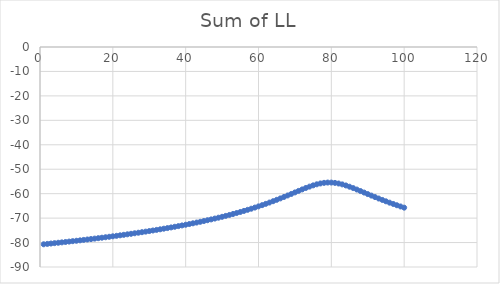
| Category | Sum of LL |
|---|---|
| 1.0 | -80.704 |
| 2.0 | -80.552 |
| 3.0 | -80.398 |
| 4.0 | -80.243 |
| 5.0 | -80.085 |
| 6.0 | -79.926 |
| 7.0 | -79.764 |
| 8.0 | -79.6 |
| 9.0 | -79.434 |
| 10.0 | -79.266 |
| 11.0 | -79.095 |
| 12.0 | -78.922 |
| 13.0 | -78.747 |
| 14.0 | -78.569 |
| 15.0 | -78.388 |
| 16.0 | -78.204 |
| 17.0 | -78.018 |
| 18.0 | -77.829 |
| 19.0 | -77.637 |
| 20.0 | -77.442 |
| 21.0 | -77.244 |
| 22.0 | -77.042 |
| 23.0 | -76.837 |
| 24.0 | -76.629 |
| 25.0 | -76.417 |
| 26.0 | -76.202 |
| 27.0 | -75.982 |
| 28.0 | -75.759 |
| 29.0 | -75.532 |
| 30.0 | -75.3 |
| 31.0 | -75.064 |
| 32.0 | -74.823 |
| 33.0 | -74.578 |
| 34.0 | -74.328 |
| 35.0 | -74.073 |
| 36.0 | -73.812 |
| 37.0 | -73.546 |
| 38.0 | -73.275 |
| 39.0 | -72.997 |
| 40.0 | -72.713 |
| 41.0 | -72.423 |
| 42.0 | -72.126 |
| 43.0 | -71.822 |
| 44.0 | -71.511 |
| 45.0 | -71.191 |
| 46.0 | -70.864 |
| 47.0 | -70.529 |
| 48.0 | -70.185 |
| 49.0 | -69.831 |
| 50.0 | -69.468 |
| 51.0 | -69.095 |
| 52.0 | -68.711 |
| 53.0 | -68.317 |
| 54.0 | -67.91 |
| 55.0 | -67.492 |
| 56.0 | -67.06 |
| 57.0 | -66.616 |
| 58.0 | -66.158 |
| 59.0 | -65.685 |
| 60.0 | -65.197 |
| 61.0 | -64.694 |
| 62.0 | -64.175 |
| 63.0 | -63.64 |
| 64.0 | -63.089 |
| 65.0 | -62.522 |
| 66.0 | -61.939 |
| 67.0 | -61.343 |
| 68.0 | -60.734 |
| 69.0 | -60.116 |
| 70.0 | -59.494 |
| 71.0 | -58.873 |
| 72.0 | -58.261 |
| 73.0 | -57.67 |
| 74.0 | -57.114 |
| 75.0 | -56.607 |
| 76.0 | -56.17 |
| 77.0 | -55.821 |
| 78.0 | -55.578 |
| 79.0 | -55.455 |
| 80.0 | -55.46 |
| 81.0 | -55.593 |
| 82.0 | -55.845 |
| 83.0 | -56.202 |
| 84.0 | -56.646 |
| 85.0 | -57.157 |
| 86.0 | -57.717 |
| 87.0 | -58.311 |
| 88.0 | -58.923 |
| 89.0 | -59.545 |
| 90.0 | -60.167 |
| 91.0 | -60.784 |
| 92.0 | -61.392 |
| 93.0 | -61.987 |
| 94.0 | -62.568 |
| 95.0 | -63.134 |
| 96.0 | -63.684 |
| 97.0 | -64.218 |
| 98.0 | -64.735 |
| 99.0 | -65.237 |
| 100.0 | -65.724 |